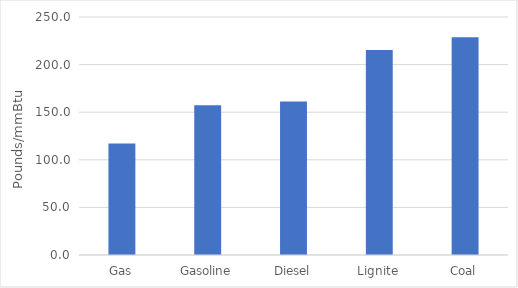
| Category | Pounds per mmBtu |
|---|---|
| Gas | 117 |
| Gasoline | 157.2 |
| Diesel | 161.3 |
| Lignite | 215.4 |
| Coal | 228.6 |